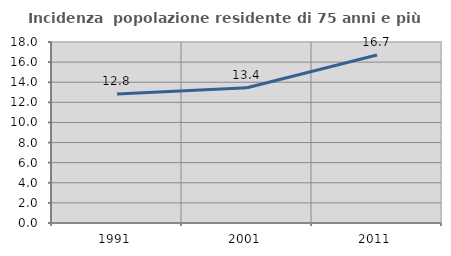
| Category | Incidenza  popolazione residente di 75 anni e più |
|---|---|
| 1991.0 | 12.827 |
| 2001.0 | 13.445 |
| 2011.0 | 16.715 |